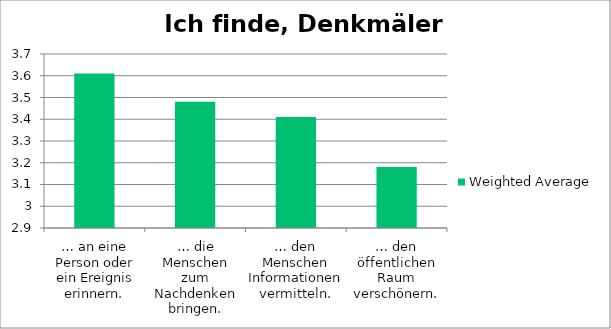
| Category | Weighted Average |
|---|---|
| … an eine Person oder ein Ereignis erinnern. | 3.61 |
| … die Menschen zum Nachdenken bringen. | 3.48 |
| … den Menschen Informationen vermitteln. | 3.41 |
| … den öffentlichen Raum verschönern. | 3.18 |